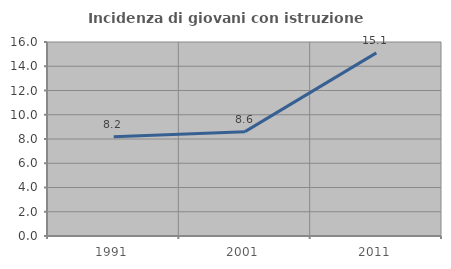
| Category | Incidenza di giovani con istruzione universitaria |
|---|---|
| 1991.0 | 8.192 |
| 2001.0 | 8.605 |
| 2011.0 | 15.104 |